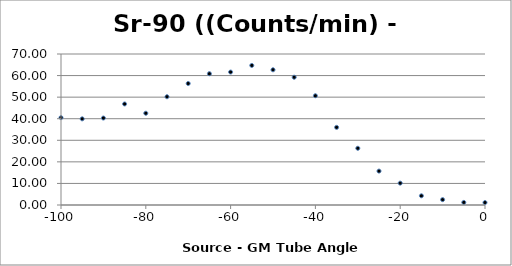
| Category | Series 0 |
|---|---|
| -100.0 | 40.498 |
| -95.0 | 39.946 |
| -90.0 | 40.306 |
| -85.0 | 46.837 |
| -80.0 | 42.534 |
| -75.0 | 50.185 |
| -70.0 | 56.328 |
| -65.0 | 60.869 |
| -60.0 | 61.624 |
| -55.0 | 64.696 |
| -50.0 | 62.686 |
| -45.0 | 59.224 |
| -40.0 | 50.646 |
| -35.0 | 35.986 |
| -30.0 | 26.292 |
| -25.0 | 15.716 |
| -20.0 | 10.133 |
| -15.0 | 4.265 |
| -10.0 | 2.486 |
| -5.0 | 1.196 |
| 0.0 | 1.148 |